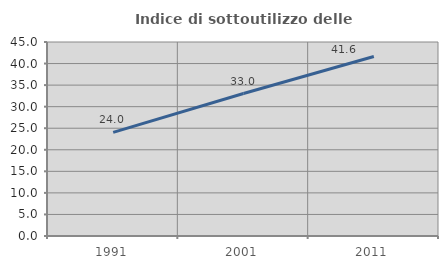
| Category | Indice di sottoutilizzo delle abitazioni  |
|---|---|
| 1991.0 | 24.038 |
| 2001.0 | 33.042 |
| 2011.0 | 41.632 |